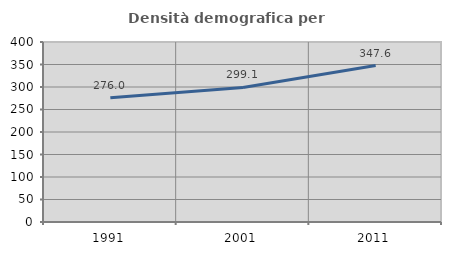
| Category | Densità demografica |
|---|---|
| 1991.0 | 276.029 |
| 2001.0 | 299.095 |
| 2011.0 | 347.585 |